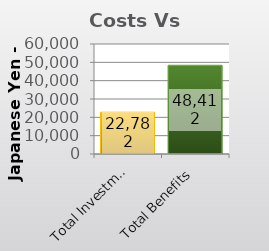
| Category | Project Total |
|---|---|
| Total Investment | 22782.287 |
| Total Benefits | 48412.359 |